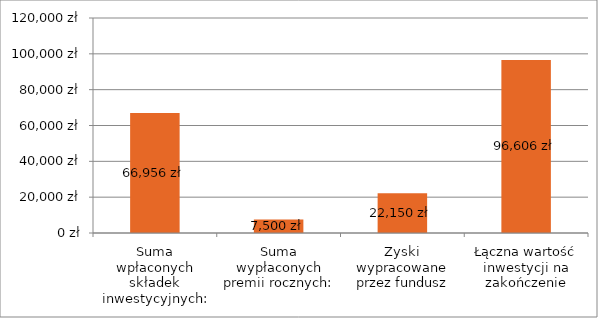
| Category | Series 0 |
|---|---|
| Suma wpłaconych składek inwestycyjnych: | 66956.09 |
| Suma wypłaconych premii rocznych: | 7500 |
| Zyski wypracowane przez fundusz | 22150.101 |
| Łączna wartość inwestycji na zakończenie | 96606.191 |